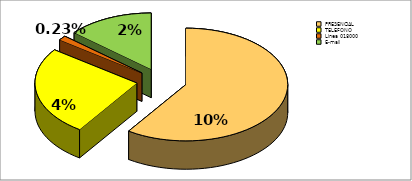
| Category | Series 0 |
|---|---|
| PRESENCIAL | 0.102 |
| TELEFONO | 0.044 |
| Lìnea 018000 | 0.002 |
| E-mail | 0.024 |